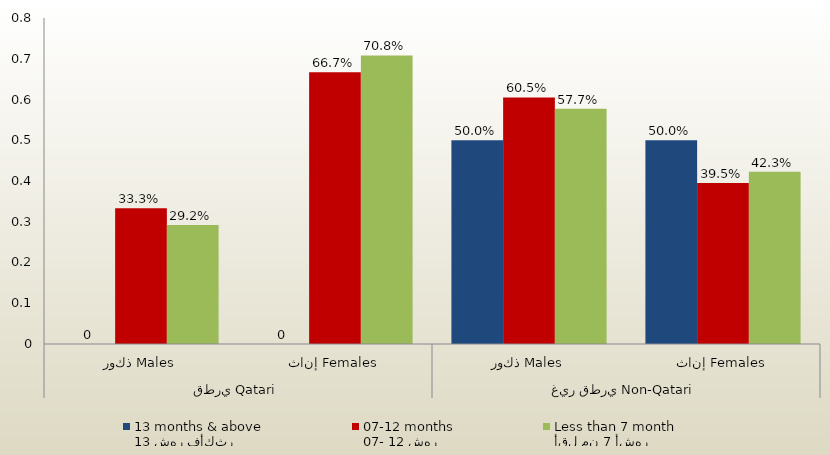
| Category | 13 شهر فأكثر
13 months & above | 07- 12 شهر
07-12 months | أقل من 7 أشهر
Less than 7 month  |
|---|---|---|---|
| 0 | 0 | 0.333 | 0.292 |
| 1 | 0 | 0.667 | 0.708 |
| 2 | 0.5 | 0.605 | 0.577 |
| 3 | 0.5 | 0.395 | 0.423 |